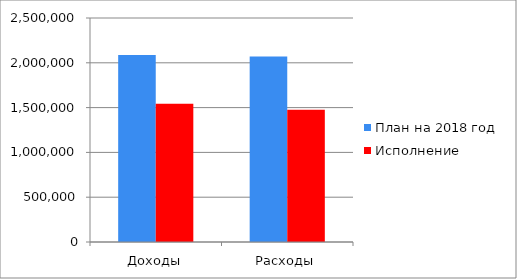
| Category | План на 2018 год | Исполнение |
|---|---|---|
| Доходы | 2086419 | 1541821 |
| Расходы | 2070141 | 1476597 |